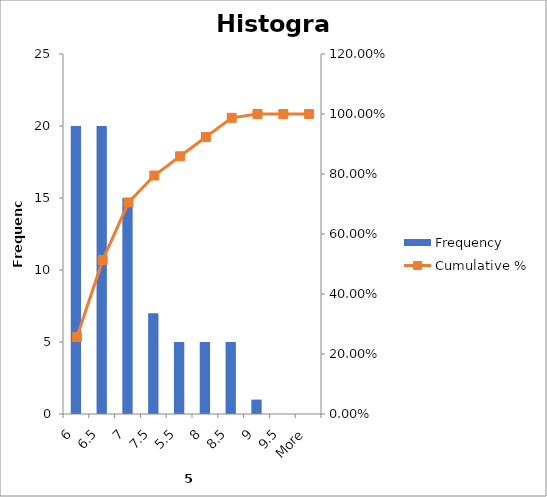
| Category | Frequency |
|---|---|
| 6 | 20 |
| 6.5 | 20 |
| 7 | 15 |
| 7.5 | 7 |
| 5.5 | 5 |
| 8 | 5 |
| 8.5 | 5 |
| 9 | 1 |
| 9.5 | 0 |
| More | 0 |